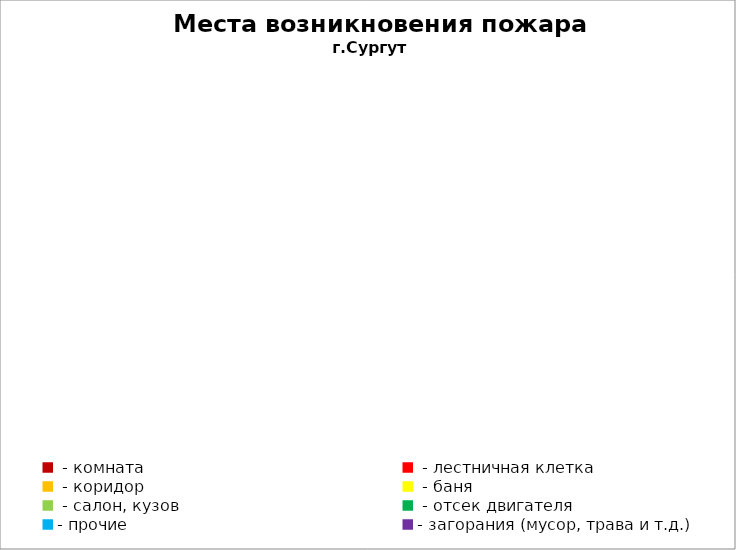
| Category | Места возникновения пожара |
|---|---|
|  - комната | 6 |
|  - лестничная клетка | 1 |
|  - коридор | 0 |
|  - баня | 2 |
|  - салон, кузов | 3 |
|  - отсек двигателя | 13 |
| - прочие | 34 |
| - загорания (мусор, трава и т.д.)  | 5 |